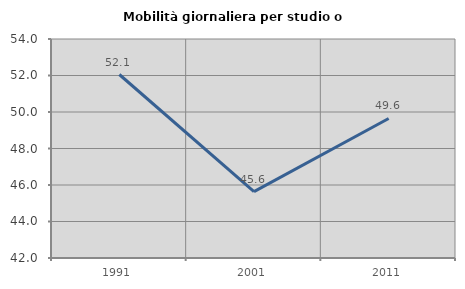
| Category | Mobilità giornaliera per studio o lavoro |
|---|---|
| 1991.0 | 52.055 |
| 2001.0 | 45.638 |
| 2011.0 | 49.645 |